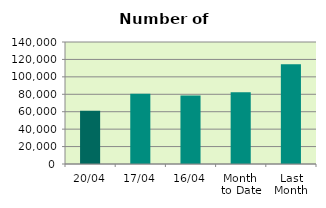
| Category | Series 0 |
|---|---|
| 20/04 | 61156 |
| 17/04 | 80754 |
| 16/04 | 78604 |
| Month 
to Date | 82378 |
| Last
Month | 114377.455 |